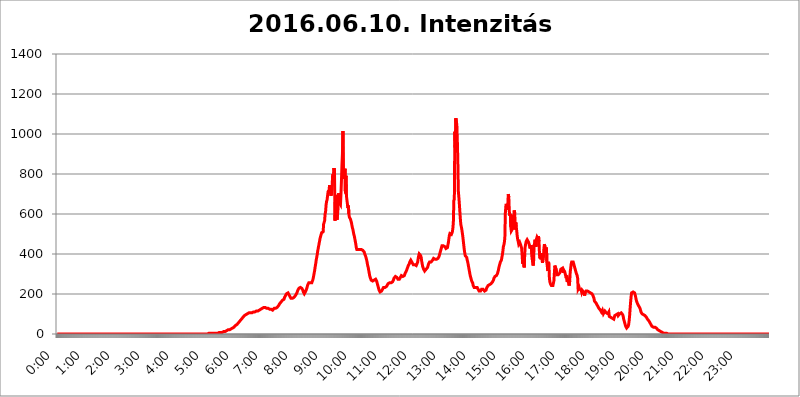
| Category | 2016.06.10. Intenzitás [W/m^2] |
|---|---|
| 0.0 | 0 |
| 0.0006944444444444445 | 0 |
| 0.001388888888888889 | 0 |
| 0.0020833333333333333 | 0 |
| 0.002777777777777778 | 0 |
| 0.003472222222222222 | 0 |
| 0.004166666666666667 | 0 |
| 0.004861111111111111 | 0 |
| 0.005555555555555556 | 0 |
| 0.0062499999999999995 | 0 |
| 0.006944444444444444 | 0 |
| 0.007638888888888889 | 0 |
| 0.008333333333333333 | 0 |
| 0.009027777777777779 | 0 |
| 0.009722222222222222 | 0 |
| 0.010416666666666666 | 0 |
| 0.011111111111111112 | 0 |
| 0.011805555555555555 | 0 |
| 0.012499999999999999 | 0 |
| 0.013194444444444444 | 0 |
| 0.013888888888888888 | 0 |
| 0.014583333333333332 | 0 |
| 0.015277777777777777 | 0 |
| 0.015972222222222224 | 0 |
| 0.016666666666666666 | 0 |
| 0.017361111111111112 | 0 |
| 0.018055555555555557 | 0 |
| 0.01875 | 0 |
| 0.019444444444444445 | 0 |
| 0.02013888888888889 | 0 |
| 0.020833333333333332 | 0 |
| 0.02152777777777778 | 0 |
| 0.022222222222222223 | 0 |
| 0.02291666666666667 | 0 |
| 0.02361111111111111 | 0 |
| 0.024305555555555556 | 0 |
| 0.024999999999999998 | 0 |
| 0.025694444444444447 | 0 |
| 0.02638888888888889 | 0 |
| 0.027083333333333334 | 0 |
| 0.027777777777777776 | 0 |
| 0.02847222222222222 | 0 |
| 0.029166666666666664 | 0 |
| 0.029861111111111113 | 0 |
| 0.030555555555555555 | 0 |
| 0.03125 | 0 |
| 0.03194444444444445 | 0 |
| 0.03263888888888889 | 0 |
| 0.03333333333333333 | 0 |
| 0.034027777777777775 | 0 |
| 0.034722222222222224 | 0 |
| 0.035416666666666666 | 0 |
| 0.036111111111111115 | 0 |
| 0.03680555555555556 | 0 |
| 0.0375 | 0 |
| 0.03819444444444444 | 0 |
| 0.03888888888888889 | 0 |
| 0.03958333333333333 | 0 |
| 0.04027777777777778 | 0 |
| 0.04097222222222222 | 0 |
| 0.041666666666666664 | 0 |
| 0.042361111111111106 | 0 |
| 0.04305555555555556 | 0 |
| 0.043750000000000004 | 0 |
| 0.044444444444444446 | 0 |
| 0.04513888888888889 | 0 |
| 0.04583333333333334 | 0 |
| 0.04652777777777778 | 0 |
| 0.04722222222222222 | 0 |
| 0.04791666666666666 | 0 |
| 0.04861111111111111 | 0 |
| 0.049305555555555554 | 0 |
| 0.049999999999999996 | 0 |
| 0.05069444444444445 | 0 |
| 0.051388888888888894 | 0 |
| 0.052083333333333336 | 0 |
| 0.05277777777777778 | 0 |
| 0.05347222222222222 | 0 |
| 0.05416666666666667 | 0 |
| 0.05486111111111111 | 0 |
| 0.05555555555555555 | 0 |
| 0.05625 | 0 |
| 0.05694444444444444 | 0 |
| 0.057638888888888885 | 0 |
| 0.05833333333333333 | 0 |
| 0.05902777777777778 | 0 |
| 0.059722222222222225 | 0 |
| 0.06041666666666667 | 0 |
| 0.061111111111111116 | 0 |
| 0.06180555555555556 | 0 |
| 0.0625 | 0 |
| 0.06319444444444444 | 0 |
| 0.06388888888888888 | 0 |
| 0.06458333333333334 | 0 |
| 0.06527777777777778 | 0 |
| 0.06597222222222222 | 0 |
| 0.06666666666666667 | 0 |
| 0.06736111111111111 | 0 |
| 0.06805555555555555 | 0 |
| 0.06874999999999999 | 0 |
| 0.06944444444444443 | 0 |
| 0.07013888888888889 | 0 |
| 0.07083333333333333 | 0 |
| 0.07152777777777779 | 0 |
| 0.07222222222222223 | 0 |
| 0.07291666666666667 | 0 |
| 0.07361111111111111 | 0 |
| 0.07430555555555556 | 0 |
| 0.075 | 0 |
| 0.07569444444444444 | 0 |
| 0.0763888888888889 | 0 |
| 0.07708333333333334 | 0 |
| 0.07777777777777778 | 0 |
| 0.07847222222222222 | 0 |
| 0.07916666666666666 | 0 |
| 0.0798611111111111 | 0 |
| 0.08055555555555556 | 0 |
| 0.08125 | 0 |
| 0.08194444444444444 | 0 |
| 0.08263888888888889 | 0 |
| 0.08333333333333333 | 0 |
| 0.08402777777777777 | 0 |
| 0.08472222222222221 | 0 |
| 0.08541666666666665 | 0 |
| 0.08611111111111112 | 0 |
| 0.08680555555555557 | 0 |
| 0.08750000000000001 | 0 |
| 0.08819444444444445 | 0 |
| 0.08888888888888889 | 0 |
| 0.08958333333333333 | 0 |
| 0.09027777777777778 | 0 |
| 0.09097222222222222 | 0 |
| 0.09166666666666667 | 0 |
| 0.09236111111111112 | 0 |
| 0.09305555555555556 | 0 |
| 0.09375 | 0 |
| 0.09444444444444444 | 0 |
| 0.09513888888888888 | 0 |
| 0.09583333333333333 | 0 |
| 0.09652777777777777 | 0 |
| 0.09722222222222222 | 0 |
| 0.09791666666666667 | 0 |
| 0.09861111111111111 | 0 |
| 0.09930555555555555 | 0 |
| 0.09999999999999999 | 0 |
| 0.10069444444444443 | 0 |
| 0.1013888888888889 | 0 |
| 0.10208333333333335 | 0 |
| 0.10277777777777779 | 0 |
| 0.10347222222222223 | 0 |
| 0.10416666666666667 | 0 |
| 0.10486111111111111 | 0 |
| 0.10555555555555556 | 0 |
| 0.10625 | 0 |
| 0.10694444444444444 | 0 |
| 0.1076388888888889 | 0 |
| 0.10833333333333334 | 0 |
| 0.10902777777777778 | 0 |
| 0.10972222222222222 | 0 |
| 0.1111111111111111 | 0 |
| 0.11180555555555556 | 0 |
| 0.11180555555555556 | 0 |
| 0.1125 | 0 |
| 0.11319444444444444 | 0 |
| 0.11388888888888889 | 0 |
| 0.11458333333333333 | 0 |
| 0.11527777777777777 | 0 |
| 0.11597222222222221 | 0 |
| 0.11666666666666665 | 0 |
| 0.1173611111111111 | 0 |
| 0.11805555555555557 | 0 |
| 0.11944444444444445 | 0 |
| 0.12013888888888889 | 0 |
| 0.12083333333333333 | 0 |
| 0.12152777777777778 | 0 |
| 0.12222222222222223 | 0 |
| 0.12291666666666667 | 0 |
| 0.12291666666666667 | 0 |
| 0.12361111111111112 | 0 |
| 0.12430555555555556 | 0 |
| 0.125 | 0 |
| 0.12569444444444444 | 0 |
| 0.12638888888888888 | 0 |
| 0.12708333333333333 | 0 |
| 0.16875 | 0 |
| 0.12847222222222224 | 0 |
| 0.12916666666666668 | 0 |
| 0.12986111111111112 | 0 |
| 0.13055555555555556 | 0 |
| 0.13125 | 0 |
| 0.13194444444444445 | 0 |
| 0.1326388888888889 | 0 |
| 0.13333333333333333 | 0 |
| 0.13402777777777777 | 0 |
| 0.13402777777777777 | 0 |
| 0.13472222222222222 | 0 |
| 0.13541666666666666 | 0 |
| 0.1361111111111111 | 0 |
| 0.13749999999999998 | 0 |
| 0.13819444444444443 | 0 |
| 0.1388888888888889 | 0 |
| 0.13958333333333334 | 0 |
| 0.14027777777777778 | 0 |
| 0.14097222222222222 | 0 |
| 0.14166666666666666 | 0 |
| 0.1423611111111111 | 0 |
| 0.14305555555555557 | 0 |
| 0.14375000000000002 | 0 |
| 0.14444444444444446 | 0 |
| 0.1451388888888889 | 0 |
| 0.1451388888888889 | 0 |
| 0.14652777777777778 | 0 |
| 0.14722222222222223 | 0 |
| 0.14791666666666667 | 0 |
| 0.1486111111111111 | 0 |
| 0.14930555555555555 | 0 |
| 0.15 | 0 |
| 0.15069444444444444 | 0 |
| 0.15138888888888888 | 0 |
| 0.15208333333333332 | 0 |
| 0.15277777777777776 | 0 |
| 0.15347222222222223 | 0 |
| 0.15416666666666667 | 0 |
| 0.15486111111111112 | 0 |
| 0.15555555555555556 | 0 |
| 0.15625 | 0 |
| 0.15694444444444444 | 0 |
| 0.15763888888888888 | 0 |
| 0.15833333333333333 | 0 |
| 0.15902777777777777 | 0 |
| 0.15972222222222224 | 0 |
| 0.16041666666666668 | 0 |
| 0.16111111111111112 | 0 |
| 0.16180555555555556 | 0 |
| 0.1625 | 0 |
| 0.16319444444444445 | 0 |
| 0.1638888888888889 | 0 |
| 0.16458333333333333 | 0 |
| 0.16527777777777777 | 0 |
| 0.16597222222222222 | 0 |
| 0.16666666666666666 | 0 |
| 0.1673611111111111 | 0 |
| 0.16805555555555554 | 0 |
| 0.16874999999999998 | 0 |
| 0.16944444444444443 | 0 |
| 0.17013888888888887 | 0 |
| 0.1708333333333333 | 0 |
| 0.17152777777777775 | 0 |
| 0.17222222222222225 | 0 |
| 0.1729166666666667 | 0 |
| 0.17361111111111113 | 0 |
| 0.17430555555555557 | 0 |
| 0.17500000000000002 | 0 |
| 0.17569444444444446 | 0 |
| 0.1763888888888889 | 0 |
| 0.17708333333333334 | 0 |
| 0.17777777777777778 | 0 |
| 0.17847222222222223 | 0 |
| 0.17916666666666667 | 0 |
| 0.1798611111111111 | 0 |
| 0.18055555555555555 | 0 |
| 0.18125 | 0 |
| 0.18194444444444444 | 0 |
| 0.1826388888888889 | 0 |
| 0.18333333333333335 | 0 |
| 0.1840277777777778 | 0 |
| 0.18472222222222223 | 0 |
| 0.18541666666666667 | 0 |
| 0.18611111111111112 | 0 |
| 0.18680555555555556 | 0 |
| 0.1875 | 0 |
| 0.18819444444444444 | 0 |
| 0.18888888888888888 | 0 |
| 0.18958333333333333 | 0 |
| 0.19027777777777777 | 0 |
| 0.1909722222222222 | 0 |
| 0.19166666666666665 | 0 |
| 0.19236111111111112 | 0 |
| 0.19305555555555554 | 0 |
| 0.19375 | 0 |
| 0.19444444444444445 | 0 |
| 0.1951388888888889 | 0 |
| 0.19583333333333333 | 0 |
| 0.19652777777777777 | 0 |
| 0.19722222222222222 | 0 |
| 0.19791666666666666 | 0 |
| 0.1986111111111111 | 0 |
| 0.19930555555555554 | 0 |
| 0.19999999999999998 | 0 |
| 0.20069444444444443 | 0 |
| 0.20138888888888887 | 0 |
| 0.2020833333333333 | 0 |
| 0.2027777777777778 | 0 |
| 0.2034722222222222 | 0 |
| 0.2041666666666667 | 0 |
| 0.20486111111111113 | 0 |
| 0.20555555555555557 | 0 |
| 0.20625000000000002 | 0 |
| 0.20694444444444446 | 0 |
| 0.2076388888888889 | 0 |
| 0.20833333333333334 | 0 |
| 0.20902777777777778 | 0 |
| 0.20972222222222223 | 0 |
| 0.21041666666666667 | 0 |
| 0.2111111111111111 | 0 |
| 0.21180555555555555 | 0 |
| 0.2125 | 3.525 |
| 0.21319444444444444 | 3.525 |
| 0.2138888888888889 | 3.525 |
| 0.21458333333333335 | 3.525 |
| 0.2152777777777778 | 3.525 |
| 0.21597222222222223 | 3.525 |
| 0.21666666666666667 | 3.525 |
| 0.21736111111111112 | 3.525 |
| 0.21805555555555556 | 3.525 |
| 0.21875 | 3.525 |
| 0.21944444444444444 | 3.525 |
| 0.22013888888888888 | 3.525 |
| 0.22083333333333333 | 3.525 |
| 0.22152777777777777 | 3.525 |
| 0.2222222222222222 | 3.525 |
| 0.22291666666666665 | 3.525 |
| 0.2236111111111111 | 3.525 |
| 0.22430555555555556 | 3.525 |
| 0.225 | 3.525 |
| 0.22569444444444445 | 3.525 |
| 0.2263888888888889 | 7.887 |
| 0.22708333333333333 | 7.887 |
| 0.22777777777777777 | 7.887 |
| 0.22847222222222222 | 7.887 |
| 0.22916666666666666 | 7.887 |
| 0.2298611111111111 | 7.887 |
| 0.23055555555555554 | 7.887 |
| 0.23124999999999998 | 7.887 |
| 0.23194444444444443 | 12.257 |
| 0.23263888888888887 | 12.257 |
| 0.2333333333333333 | 12.257 |
| 0.2340277777777778 | 12.257 |
| 0.2347222222222222 | 12.257 |
| 0.2354166666666667 | 12.257 |
| 0.23611111111111113 | 16.636 |
| 0.23680555555555557 | 16.636 |
| 0.23750000000000002 | 16.636 |
| 0.23819444444444446 | 16.636 |
| 0.2388888888888889 | 21.024 |
| 0.23958333333333334 | 21.024 |
| 0.24027777777777778 | 21.024 |
| 0.24097222222222223 | 21.024 |
| 0.24166666666666667 | 21.024 |
| 0.2423611111111111 | 21.024 |
| 0.24305555555555555 | 21.024 |
| 0.24375 | 25.419 |
| 0.24444444444444446 | 25.419 |
| 0.24513888888888888 | 29.823 |
| 0.24583333333333335 | 29.823 |
| 0.2465277777777778 | 29.823 |
| 0.24722222222222223 | 34.234 |
| 0.24791666666666667 | 34.234 |
| 0.24861111111111112 | 38.653 |
| 0.24930555555555556 | 38.653 |
| 0.25 | 43.079 |
| 0.25069444444444444 | 43.079 |
| 0.2513888888888889 | 47.511 |
| 0.2520833333333333 | 47.511 |
| 0.25277777777777777 | 51.951 |
| 0.2534722222222222 | 51.951 |
| 0.25416666666666665 | 56.398 |
| 0.2548611111111111 | 56.398 |
| 0.2555555555555556 | 60.85 |
| 0.25625000000000003 | 65.31 |
| 0.2569444444444445 | 65.31 |
| 0.2576388888888889 | 69.775 |
| 0.25833333333333336 | 74.246 |
| 0.2590277777777778 | 74.246 |
| 0.25972222222222224 | 78.722 |
| 0.2604166666666667 | 83.205 |
| 0.2611111111111111 | 83.205 |
| 0.26180555555555557 | 87.692 |
| 0.2625 | 92.184 |
| 0.26319444444444445 | 92.184 |
| 0.2638888888888889 | 92.184 |
| 0.26458333333333334 | 96.682 |
| 0.2652777777777778 | 96.682 |
| 0.2659722222222222 | 101.184 |
| 0.26666666666666666 | 101.184 |
| 0.2673611111111111 | 101.184 |
| 0.26805555555555555 | 101.184 |
| 0.26875 | 105.69 |
| 0.26944444444444443 | 105.69 |
| 0.2701388888888889 | 105.69 |
| 0.2708333333333333 | 105.69 |
| 0.27152777777777776 | 105.69 |
| 0.2722222222222222 | 105.69 |
| 0.27291666666666664 | 105.69 |
| 0.2736111111111111 | 105.69 |
| 0.2743055555555555 | 105.69 |
| 0.27499999999999997 | 110.201 |
| 0.27569444444444446 | 110.201 |
| 0.27638888888888885 | 110.201 |
| 0.27708333333333335 | 110.201 |
| 0.2777777777777778 | 110.201 |
| 0.27847222222222223 | 110.201 |
| 0.2791666666666667 | 114.716 |
| 0.2798611111111111 | 110.201 |
| 0.28055555555555556 | 114.716 |
| 0.28125 | 114.716 |
| 0.28194444444444444 | 119.235 |
| 0.2826388888888889 | 119.235 |
| 0.2833333333333333 | 119.235 |
| 0.28402777777777777 | 119.235 |
| 0.2847222222222222 | 123.758 |
| 0.28541666666666665 | 123.758 |
| 0.28611111111111115 | 123.758 |
| 0.28680555555555554 | 128.284 |
| 0.28750000000000003 | 128.284 |
| 0.2881944444444445 | 128.284 |
| 0.2888888888888889 | 132.814 |
| 0.28958333333333336 | 132.814 |
| 0.2902777777777778 | 132.814 |
| 0.29097222222222224 | 132.814 |
| 0.2916666666666667 | 132.814 |
| 0.2923611111111111 | 128.284 |
| 0.29305555555555557 | 128.284 |
| 0.29375 | 128.284 |
| 0.29444444444444445 | 128.284 |
| 0.2951388888888889 | 128.284 |
| 0.29583333333333334 | 128.284 |
| 0.2965277777777778 | 128.284 |
| 0.2972222222222222 | 128.284 |
| 0.29791666666666666 | 123.758 |
| 0.2986111111111111 | 128.284 |
| 0.29930555555555555 | 123.758 |
| 0.3 | 123.758 |
| 0.30069444444444443 | 119.235 |
| 0.3013888888888889 | 119.235 |
| 0.3020833333333333 | 119.235 |
| 0.30277777777777776 | 123.758 |
| 0.3034722222222222 | 123.758 |
| 0.30416666666666664 | 128.284 |
| 0.3048611111111111 | 128.284 |
| 0.3055555555555555 | 128.284 |
| 0.30624999999999997 | 128.284 |
| 0.3069444444444444 | 132.814 |
| 0.3076388888888889 | 132.814 |
| 0.30833333333333335 | 132.814 |
| 0.3090277777777778 | 137.347 |
| 0.30972222222222223 | 137.347 |
| 0.3104166666666667 | 141.884 |
| 0.3111111111111111 | 146.423 |
| 0.31180555555555556 | 150.964 |
| 0.3125 | 155.509 |
| 0.31319444444444444 | 155.509 |
| 0.3138888888888889 | 160.056 |
| 0.3145833333333333 | 164.605 |
| 0.31527777777777777 | 164.605 |
| 0.3159722222222222 | 169.156 |
| 0.31666666666666665 | 169.156 |
| 0.31736111111111115 | 173.709 |
| 0.31805555555555554 | 173.709 |
| 0.31875000000000003 | 182.82 |
| 0.3194444444444445 | 182.82 |
| 0.3201388888888889 | 191.937 |
| 0.32083333333333336 | 196.497 |
| 0.3215277777777778 | 201.058 |
| 0.32222222222222224 | 201.058 |
| 0.3229166666666667 | 205.62 |
| 0.3236111111111111 | 205.62 |
| 0.32430555555555557 | 201.058 |
| 0.325 | 196.497 |
| 0.32569444444444445 | 191.937 |
| 0.3263888888888889 | 187.378 |
| 0.32708333333333334 | 182.82 |
| 0.3277777777777778 | 178.264 |
| 0.3284722222222222 | 173.709 |
| 0.32916666666666666 | 173.709 |
| 0.3298611111111111 | 178.264 |
| 0.33055555555555555 | 178.264 |
| 0.33125 | 182.82 |
| 0.33194444444444443 | 182.82 |
| 0.3326388888888889 | 187.378 |
| 0.3333333333333333 | 187.378 |
| 0.3340277777777778 | 191.937 |
| 0.3347222222222222 | 196.497 |
| 0.3354166666666667 | 196.497 |
| 0.3361111111111111 | 205.62 |
| 0.3368055555555556 | 210.182 |
| 0.33749999999999997 | 219.309 |
| 0.33819444444444446 | 219.309 |
| 0.33888888888888885 | 228.436 |
| 0.33958333333333335 | 228.436 |
| 0.34027777777777773 | 233 |
| 0.34097222222222223 | 233 |
| 0.3416666666666666 | 233 |
| 0.3423611111111111 | 233 |
| 0.3430555555555555 | 228.436 |
| 0.34375 | 223.873 |
| 0.3444444444444445 | 219.309 |
| 0.3451388888888889 | 210.182 |
| 0.3458333333333334 | 205.62 |
| 0.34652777777777777 | 201.058 |
| 0.34722222222222227 | 201.058 |
| 0.34791666666666665 | 205.62 |
| 0.34861111111111115 | 214.746 |
| 0.34930555555555554 | 219.309 |
| 0.35000000000000003 | 228.436 |
| 0.3506944444444444 | 237.564 |
| 0.3513888888888889 | 246.689 |
| 0.3520833333333333 | 251.251 |
| 0.3527777777777778 | 255.813 |
| 0.3534722222222222 | 255.813 |
| 0.3541666666666667 | 255.813 |
| 0.3548611111111111 | 255.813 |
| 0.35555555555555557 | 251.251 |
| 0.35625 | 251.251 |
| 0.35694444444444445 | 255.813 |
| 0.3576388888888889 | 260.373 |
| 0.35833333333333334 | 269.49 |
| 0.3590277777777778 | 278.603 |
| 0.3597222222222222 | 292.259 |
| 0.36041666666666666 | 305.898 |
| 0.3611111111111111 | 319.517 |
| 0.36180555555555555 | 337.639 |
| 0.3625 | 351.198 |
| 0.36319444444444443 | 369.23 |
| 0.3638888888888889 | 382.715 |
| 0.3645833333333333 | 396.164 |
| 0.3652777777777778 | 414.035 |
| 0.3659722222222222 | 427.39 |
| 0.3666666666666667 | 440.702 |
| 0.3673611111111111 | 453.968 |
| 0.3680555555555556 | 467.187 |
| 0.36874999999999997 | 480.356 |
| 0.36944444444444446 | 489.108 |
| 0.37013888888888885 | 497.836 |
| 0.37083333333333335 | 506.542 |
| 0.37152777777777773 | 510.885 |
| 0.37222222222222223 | 506.542 |
| 0.3729166666666666 | 510.885 |
| 0.3736111111111111 | 549.704 |
| 0.3743055555555555 | 558.261 |
| 0.375 | 566.793 |
| 0.3756944444444445 | 600.661 |
| 0.3763888888888889 | 613.252 |
| 0.3770833333333334 | 646.537 |
| 0.37777777777777777 | 663.019 |
| 0.37847222222222227 | 671.22 |
| 0.37916666666666665 | 691.608 |
| 0.37986111111111115 | 711.832 |
| 0.38055555555555554 | 715.858 |
| 0.38125000000000003 | 719.877 |
| 0.3819444444444444 | 743.859 |
| 0.3826388888888889 | 703.762 |
| 0.3833333333333333 | 727.896 |
| 0.3840277777777778 | 691.608 |
| 0.3847222222222222 | 711.832 |
| 0.3854166666666667 | 727.896 |
| 0.3861111111111111 | 787.258 |
| 0.38680555555555557 | 798.974 |
| 0.3875 | 763.674 |
| 0.38819444444444445 | 829.981 |
| 0.3888888888888889 | 798.974 |
| 0.38958333333333334 | 566.793 |
| 0.3902777777777778 | 695.666 |
| 0.3909722222222222 | 642.4 |
| 0.39166666666666666 | 613.252 |
| 0.3923611111111111 | 571.049 |
| 0.39305555555555555 | 596.45 |
| 0.39375 | 625.784 |
| 0.39444444444444443 | 703.762 |
| 0.3951388888888889 | 683.473 |
| 0.3958333333333333 | 654.791 |
| 0.3965277777777778 | 654.791 |
| 0.3972222222222222 | 646.537 |
| 0.3979166666666667 | 699.717 |
| 0.3986111111111111 | 767.62 |
| 0.3993055555555556 | 845.365 |
| 0.39999999999999997 | 902.447 |
| 0.40069444444444446 | 1014.852 |
| 0.40138888888888885 | 775.492 |
| 0.40208333333333335 | 810.641 |
| 0.40277777777777773 | 775.492 |
| 0.40347222222222223 | 826.123 |
| 0.4041666666666666 | 703.762 |
| 0.4048611111111111 | 791.169 |
| 0.4055555555555555 | 691.608 |
| 0.40625 | 671.22 |
| 0.4069444444444445 | 650.667 |
| 0.4076388888888889 | 629.948 |
| 0.4083333333333334 | 642.4 |
| 0.40902777777777777 | 600.661 |
| 0.40972222222222227 | 583.779 |
| 0.41041666666666665 | 579.542 |
| 0.41111111111111115 | 575.299 |
| 0.41180555555555554 | 566.793 |
| 0.41250000000000003 | 558.261 |
| 0.4131944444444444 | 545.416 |
| 0.4138888888888889 | 532.513 |
| 0.4145833333333333 | 523.88 |
| 0.4152777777777778 | 510.885 |
| 0.4159722222222222 | 497.836 |
| 0.4166666666666667 | 489.108 |
| 0.4173611111111111 | 475.972 |
| 0.41805555555555557 | 462.786 |
| 0.41875 | 449.551 |
| 0.41944444444444445 | 431.833 |
| 0.4201388888888889 | 422.943 |
| 0.42083333333333334 | 418.492 |
| 0.4215277777777778 | 422.943 |
| 0.4222222222222222 | 422.943 |
| 0.42291666666666666 | 427.39 |
| 0.4236111111111111 | 422.943 |
| 0.42430555555555555 | 422.943 |
| 0.425 | 422.943 |
| 0.42569444444444443 | 422.943 |
| 0.4263888888888889 | 422.943 |
| 0.4270833333333333 | 422.943 |
| 0.4277777777777778 | 422.943 |
| 0.4284722222222222 | 418.492 |
| 0.4291666666666667 | 418.492 |
| 0.4298611111111111 | 414.035 |
| 0.4305555555555556 | 409.574 |
| 0.43124999999999997 | 400.638 |
| 0.43194444444444446 | 396.164 |
| 0.43263888888888885 | 387.202 |
| 0.43333333333333335 | 378.224 |
| 0.43402777777777773 | 369.23 |
| 0.43472222222222223 | 355.712 |
| 0.4354166666666666 | 342.162 |
| 0.4361111111111111 | 333.113 |
| 0.4368055555555555 | 319.517 |
| 0.4375 | 305.898 |
| 0.4381944444444445 | 292.259 |
| 0.4388888888888889 | 283.156 |
| 0.4395833333333334 | 278.603 |
| 0.44027777777777777 | 269.49 |
| 0.44097222222222227 | 264.932 |
| 0.44166666666666665 | 264.932 |
| 0.44236111111111115 | 264.932 |
| 0.44305555555555554 | 264.932 |
| 0.44375000000000003 | 264.932 |
| 0.4444444444444444 | 269.49 |
| 0.4451388888888889 | 274.047 |
| 0.4458333333333333 | 274.047 |
| 0.4465277777777778 | 274.047 |
| 0.4472222222222222 | 269.49 |
| 0.4479166666666667 | 264.932 |
| 0.4486111111111111 | 255.813 |
| 0.44930555555555557 | 246.689 |
| 0.45 | 237.564 |
| 0.45069444444444445 | 228.436 |
| 0.4513888888888889 | 219.309 |
| 0.45208333333333334 | 214.746 |
| 0.4527777777777778 | 210.182 |
| 0.4534722222222222 | 210.182 |
| 0.45416666666666666 | 210.182 |
| 0.4548611111111111 | 214.746 |
| 0.45555555555555555 | 219.309 |
| 0.45625 | 223.873 |
| 0.45694444444444443 | 228.436 |
| 0.4576388888888889 | 233 |
| 0.4583333333333333 | 233 |
| 0.4590277777777778 | 233 |
| 0.4597222222222222 | 233 |
| 0.4604166666666667 | 233 |
| 0.4611111111111111 | 233 |
| 0.4618055555555556 | 237.564 |
| 0.46249999999999997 | 242.127 |
| 0.46319444444444446 | 242.127 |
| 0.46388888888888885 | 251.251 |
| 0.46458333333333335 | 251.251 |
| 0.46527777777777773 | 255.813 |
| 0.46597222222222223 | 255.813 |
| 0.4666666666666666 | 255.813 |
| 0.4673611111111111 | 255.813 |
| 0.4680555555555555 | 255.813 |
| 0.46875 | 255.813 |
| 0.4694444444444445 | 260.373 |
| 0.4701388888888889 | 260.373 |
| 0.4708333333333334 | 264.932 |
| 0.47152777777777777 | 269.49 |
| 0.47222222222222227 | 278.603 |
| 0.47291666666666665 | 278.603 |
| 0.47361111111111115 | 283.156 |
| 0.47430555555555554 | 287.709 |
| 0.47500000000000003 | 287.709 |
| 0.4756944444444444 | 283.156 |
| 0.4763888888888889 | 283.156 |
| 0.4770833333333333 | 278.603 |
| 0.4777777777777778 | 274.047 |
| 0.4784722222222222 | 269.49 |
| 0.4791666666666667 | 269.49 |
| 0.4798611111111111 | 274.047 |
| 0.48055555555555557 | 278.603 |
| 0.48125 | 283.156 |
| 0.48194444444444445 | 287.709 |
| 0.4826388888888889 | 292.259 |
| 0.48333333333333334 | 292.259 |
| 0.4840277777777778 | 287.709 |
| 0.4847222222222222 | 287.709 |
| 0.48541666666666666 | 283.156 |
| 0.4861111111111111 | 287.709 |
| 0.48680555555555555 | 292.259 |
| 0.4875 | 296.808 |
| 0.48819444444444443 | 305.898 |
| 0.4888888888888889 | 310.44 |
| 0.4895833333333333 | 314.98 |
| 0.4902777777777778 | 319.517 |
| 0.4909722222222222 | 328.584 |
| 0.4916666666666667 | 333.113 |
| 0.4923611111111111 | 342.162 |
| 0.4930555555555556 | 346.682 |
| 0.49374999999999997 | 351.198 |
| 0.49444444444444446 | 360.221 |
| 0.49513888888888885 | 364.728 |
| 0.49583333333333335 | 369.23 |
| 0.49652777777777773 | 369.23 |
| 0.49722222222222223 | 364.728 |
| 0.4979166666666666 | 355.712 |
| 0.4986111111111111 | 351.198 |
| 0.4993055555555555 | 346.682 |
| 0.5 | 346.682 |
| 0.5006944444444444 | 346.682 |
| 0.5013888888888889 | 346.682 |
| 0.5020833333333333 | 346.682 |
| 0.5027777777777778 | 342.162 |
| 0.5034722222222222 | 342.162 |
| 0.5041666666666667 | 342.162 |
| 0.5048611111111111 | 346.682 |
| 0.5055555555555555 | 360.221 |
| 0.50625 | 378.224 |
| 0.5069444444444444 | 391.685 |
| 0.5076388888888889 | 400.638 |
| 0.5083333333333333 | 400.638 |
| 0.5090277777777777 | 396.164 |
| 0.5097222222222222 | 391.685 |
| 0.5104166666666666 | 382.715 |
| 0.5111111111111112 | 364.728 |
| 0.5118055555555555 | 351.198 |
| 0.5125000000000001 | 337.639 |
| 0.5131944444444444 | 333.113 |
| 0.513888888888889 | 324.052 |
| 0.5145833333333333 | 319.517 |
| 0.5152777777777778 | 314.98 |
| 0.5159722222222222 | 314.98 |
| 0.5166666666666667 | 319.517 |
| 0.517361111111111 | 324.052 |
| 0.5180555555555556 | 328.584 |
| 0.5187499999999999 | 328.584 |
| 0.5194444444444445 | 333.113 |
| 0.5201388888888888 | 342.162 |
| 0.5208333333333334 | 351.198 |
| 0.5215277777777778 | 355.712 |
| 0.5222222222222223 | 360.221 |
| 0.5229166666666667 | 360.221 |
| 0.5236111111111111 | 360.221 |
| 0.5243055555555556 | 360.221 |
| 0.525 | 360.221 |
| 0.5256944444444445 | 364.728 |
| 0.5263888888888889 | 369.23 |
| 0.5270833333333333 | 373.729 |
| 0.5277777777777778 | 378.224 |
| 0.5284722222222222 | 378.224 |
| 0.5291666666666667 | 378.224 |
| 0.5298611111111111 | 373.729 |
| 0.5305555555555556 | 373.729 |
| 0.53125 | 373.729 |
| 0.5319444444444444 | 373.729 |
| 0.5326388888888889 | 373.729 |
| 0.5333333333333333 | 378.224 |
| 0.5340277777777778 | 378.224 |
| 0.5347222222222222 | 382.715 |
| 0.5354166666666667 | 387.202 |
| 0.5361111111111111 | 391.685 |
| 0.5368055555555555 | 405.108 |
| 0.5375 | 414.035 |
| 0.5381944444444444 | 422.943 |
| 0.5388888888888889 | 431.833 |
| 0.5395833333333333 | 440.702 |
| 0.5402777777777777 | 440.702 |
| 0.5409722222222222 | 445.129 |
| 0.5416666666666666 | 440.702 |
| 0.5423611111111112 | 440.702 |
| 0.5430555555555555 | 440.702 |
| 0.5437500000000001 | 436.27 |
| 0.5444444444444444 | 431.833 |
| 0.545138888888889 | 427.39 |
| 0.5458333333333333 | 427.39 |
| 0.5465277777777778 | 427.39 |
| 0.5472222222222222 | 431.833 |
| 0.5479166666666667 | 445.129 |
| 0.548611111111111 | 458.38 |
| 0.5493055555555556 | 475.972 |
| 0.5499999999999999 | 493.475 |
| 0.5506944444444445 | 502.192 |
| 0.5513888888888888 | 502.192 |
| 0.5520833333333334 | 502.192 |
| 0.5527777777777778 | 497.836 |
| 0.5534722222222223 | 502.192 |
| 0.5541666666666667 | 510.885 |
| 0.5548611111111111 | 528.2 |
| 0.5555555555555556 | 558.261 |
| 0.55625 | 667.123 |
| 0.5569444444444445 | 675.311 |
| 0.5576388888888889 | 1011.118 |
| 0.5583333333333333 | 932.576 |
| 0.5590277777777778 | 1078.555 |
| 0.5597222222222222 | 1059.756 |
| 0.5604166666666667 | 1048.508 |
| 0.5611111111111111 | 970.034 |
| 0.5618055555555556 | 868.305 |
| 0.5625 | 715.858 |
| 0.5631944444444444 | 687.544 |
| 0.5638888888888889 | 654.791 |
| 0.5645833333333333 | 617.436 |
| 0.5652777777777778 | 579.542 |
| 0.5659722222222222 | 549.704 |
| 0.5666666666666667 | 536.82 |
| 0.5673611111111111 | 523.88 |
| 0.5680555555555555 | 506.542 |
| 0.56875 | 489.108 |
| 0.5694444444444444 | 467.187 |
| 0.5701388888888889 | 445.129 |
| 0.5708333333333333 | 422.943 |
| 0.5715277777777777 | 405.108 |
| 0.5722222222222222 | 391.685 |
| 0.5729166666666666 | 387.202 |
| 0.5736111111111112 | 387.202 |
| 0.5743055555555555 | 382.715 |
| 0.5750000000000001 | 369.23 |
| 0.5756944444444444 | 360.221 |
| 0.576388888888889 | 346.682 |
| 0.5770833333333333 | 333.113 |
| 0.5777777777777778 | 319.517 |
| 0.5784722222222222 | 305.898 |
| 0.5791666666666667 | 292.259 |
| 0.579861111111111 | 283.156 |
| 0.5805555555555556 | 274.047 |
| 0.5812499999999999 | 264.932 |
| 0.5819444444444445 | 260.373 |
| 0.5826388888888888 | 255.813 |
| 0.5833333333333334 | 242.127 |
| 0.5840277777777778 | 237.564 |
| 0.5847222222222223 | 233 |
| 0.5854166666666667 | 228.436 |
| 0.5861111111111111 | 228.436 |
| 0.5868055555555556 | 233 |
| 0.5875 | 233 |
| 0.5881944444444445 | 233 |
| 0.5888888888888889 | 233 |
| 0.5895833333333333 | 228.436 |
| 0.5902777777777778 | 223.873 |
| 0.5909722222222222 | 219.309 |
| 0.5916666666666667 | 214.746 |
| 0.5923611111111111 | 210.182 |
| 0.5930555555555556 | 210.182 |
| 0.59375 | 214.746 |
| 0.5944444444444444 | 219.309 |
| 0.5951388888888889 | 223.873 |
| 0.5958333333333333 | 228.436 |
| 0.5965277777777778 | 228.436 |
| 0.5972222222222222 | 223.873 |
| 0.5979166666666667 | 219.309 |
| 0.5986111111111111 | 219.309 |
| 0.5993055555555555 | 214.746 |
| 0.6 | 214.746 |
| 0.6006944444444444 | 219.309 |
| 0.6013888888888889 | 219.309 |
| 0.6020833333333333 | 228.436 |
| 0.6027777777777777 | 228.436 |
| 0.6034722222222222 | 233 |
| 0.6041666666666666 | 242.127 |
| 0.6048611111111112 | 246.689 |
| 0.6055555555555555 | 246.689 |
| 0.6062500000000001 | 246.689 |
| 0.6069444444444444 | 246.689 |
| 0.607638888888889 | 246.689 |
| 0.6083333333333333 | 251.251 |
| 0.6090277777777778 | 251.251 |
| 0.6097222222222222 | 255.813 |
| 0.6104166666666667 | 260.373 |
| 0.611111111111111 | 264.932 |
| 0.6118055555555556 | 269.49 |
| 0.6124999999999999 | 278.603 |
| 0.6131944444444445 | 283.156 |
| 0.6138888888888888 | 287.709 |
| 0.6145833333333334 | 287.709 |
| 0.6152777777777778 | 292.259 |
| 0.6159722222222223 | 292.259 |
| 0.6166666666666667 | 296.808 |
| 0.6173611111111111 | 301.354 |
| 0.6180555555555556 | 305.898 |
| 0.61875 | 319.517 |
| 0.6194444444444445 | 333.113 |
| 0.6201388888888889 | 342.162 |
| 0.6208333333333333 | 351.198 |
| 0.6215277777777778 | 360.221 |
| 0.6222222222222222 | 364.728 |
| 0.6229166666666667 | 369.23 |
| 0.6236111111111111 | 382.715 |
| 0.6243055555555556 | 396.164 |
| 0.625 | 414.035 |
| 0.6256944444444444 | 436.27 |
| 0.6263888888888889 | 445.129 |
| 0.6270833333333333 | 458.38 |
| 0.6277777777777778 | 480.356 |
| 0.6284722222222222 | 604.864 |
| 0.6291666666666667 | 638.256 |
| 0.6298611111111111 | 650.667 |
| 0.6305555555555555 | 621.613 |
| 0.63125 | 634.105 |
| 0.6319444444444444 | 650.667 |
| 0.6326388888888889 | 699.717 |
| 0.6333333333333333 | 683.473 |
| 0.6340277777777777 | 613.252 |
| 0.6347222222222222 | 592.233 |
| 0.6354166666666666 | 600.661 |
| 0.6361111111111112 | 536.82 |
| 0.6368055555555555 | 515.223 |
| 0.6375000000000001 | 515.223 |
| 0.6381944444444444 | 523.88 |
| 0.638888888888889 | 532.513 |
| 0.6395833333333333 | 596.45 |
| 0.6402777777777778 | 523.88 |
| 0.6409722222222222 | 617.436 |
| 0.6416666666666667 | 604.864 |
| 0.642361111111111 | 523.88 |
| 0.6430555555555556 | 558.261 |
| 0.6437499999999999 | 536.82 |
| 0.6444444444444445 | 515.223 |
| 0.6451388888888888 | 489.108 |
| 0.6458333333333334 | 471.582 |
| 0.6465277777777778 | 462.786 |
| 0.6472222222222223 | 449.551 |
| 0.6479166666666667 | 453.968 |
| 0.6486111111111111 | 458.38 |
| 0.6493055555555556 | 453.968 |
| 0.65 | 445.129 |
| 0.6506944444444445 | 440.702 |
| 0.6513888888888889 | 427.39 |
| 0.6520833333333333 | 422.943 |
| 0.6527777777777778 | 351.198 |
| 0.6534722222222222 | 382.715 |
| 0.6541666666666667 | 405.108 |
| 0.6548611111111111 | 333.113 |
| 0.6555555555555556 | 391.685 |
| 0.65625 | 436.27 |
| 0.6569444444444444 | 449.551 |
| 0.6576388888888889 | 462.786 |
| 0.6583333333333333 | 462.786 |
| 0.6590277777777778 | 471.582 |
| 0.6597222222222222 | 475.972 |
| 0.6604166666666667 | 471.582 |
| 0.6611111111111111 | 458.38 |
| 0.6618055555555555 | 449.551 |
| 0.6625 | 445.129 |
| 0.6631944444444444 | 427.39 |
| 0.6638888888888889 | 431.833 |
| 0.6645833333333333 | 445.129 |
| 0.6652777777777777 | 449.551 |
| 0.6659722222222222 | 445.129 |
| 0.6666666666666666 | 360.221 |
| 0.6673611111111111 | 342.162 |
| 0.6680555555555556 | 355.712 |
| 0.6687500000000001 | 440.702 |
| 0.6694444444444444 | 453.968 |
| 0.6701388888888888 | 471.582 |
| 0.6708333333333334 | 471.582 |
| 0.6715277777777778 | 436.27 |
| 0.6722222222222222 | 475.972 |
| 0.6729166666666666 | 484.735 |
| 0.6736111111111112 | 480.356 |
| 0.6743055555555556 | 475.972 |
| 0.6749999999999999 | 489.108 |
| 0.6756944444444444 | 462.786 |
| 0.6763888888888889 | 396.164 |
| 0.6770833333333334 | 378.224 |
| 0.6777777777777777 | 400.638 |
| 0.6784722222222223 | 373.729 |
| 0.6791666666666667 | 405.108 |
| 0.6798611111111111 | 373.729 |
| 0.6805555555555555 | 355.712 |
| 0.68125 | 351.198 |
| 0.6819444444444445 | 391.685 |
| 0.6826388888888889 | 431.833 |
| 0.6833333333333332 | 449.551 |
| 0.6840277777777778 | 449.551 |
| 0.6847222222222222 | 453.968 |
| 0.6854166666666667 | 405.108 |
| 0.686111111111111 | 431.833 |
| 0.6868055555555556 | 355.712 |
| 0.6875 | 333.113 |
| 0.6881944444444444 | 314.98 |
| 0.688888888888889 | 360.221 |
| 0.6895833333333333 | 351.198 |
| 0.6902777777777778 | 278.603 |
| 0.6909722222222222 | 260.373 |
| 0.6916666666666668 | 251.251 |
| 0.6923611111111111 | 246.689 |
| 0.6930555555555555 | 242.127 |
| 0.69375 | 237.564 |
| 0.6944444444444445 | 242.127 |
| 0.6951388888888889 | 242.127 |
| 0.6958333333333333 | 246.689 |
| 0.6965277777777777 | 264.932 |
| 0.6972222222222223 | 269.49 |
| 0.6979166666666666 | 342.162 |
| 0.6986111111111111 | 346.682 |
| 0.6993055555555556 | 337.639 |
| 0.7000000000000001 | 319.517 |
| 0.7006944444444444 | 296.808 |
| 0.7013888888888888 | 296.808 |
| 0.7020833333333334 | 296.808 |
| 0.7027777777777778 | 296.808 |
| 0.7034722222222222 | 296.808 |
| 0.7041666666666666 | 301.354 |
| 0.7048611111111112 | 305.898 |
| 0.7055555555555556 | 314.98 |
| 0.7062499999999999 | 324.052 |
| 0.7069444444444444 | 324.052 |
| 0.7076388888888889 | 328.584 |
| 0.7083333333333334 | 328.584 |
| 0.7090277777777777 | 324.052 |
| 0.7097222222222223 | 305.898 |
| 0.7104166666666667 | 319.517 |
| 0.7111111111111111 | 314.98 |
| 0.7118055555555555 | 310.44 |
| 0.7125 | 305.898 |
| 0.7131944444444445 | 305.898 |
| 0.7138888888888889 | 278.603 |
| 0.7145833333333332 | 292.259 |
| 0.7152777777777778 | 260.373 |
| 0.7159722222222222 | 269.49 |
| 0.7166666666666667 | 269.49 |
| 0.717361111111111 | 269.49 |
| 0.7180555555555556 | 242.127 |
| 0.71875 | 264.932 |
| 0.7194444444444444 | 310.44 |
| 0.720138888888889 | 328.584 |
| 0.7208333333333333 | 351.198 |
| 0.7215277777777778 | 360.221 |
| 0.7222222222222222 | 360.221 |
| 0.7229166666666668 | 360.221 |
| 0.7236111111111111 | 360.221 |
| 0.7243055555555555 | 355.712 |
| 0.725 | 342.162 |
| 0.7256944444444445 | 333.113 |
| 0.7263888888888889 | 324.052 |
| 0.7270833333333333 | 314.98 |
| 0.7277777777777777 | 305.898 |
| 0.7284722222222223 | 301.354 |
| 0.7291666666666666 | 292.259 |
| 0.7298611111111111 | 278.603 |
| 0.7305555555555556 | 223.873 |
| 0.7312500000000001 | 223.873 |
| 0.7319444444444444 | 233 |
| 0.7326388888888888 | 223.873 |
| 0.7333333333333334 | 228.436 |
| 0.7340277777777778 | 228.436 |
| 0.7347222222222222 | 219.309 |
| 0.7354166666666666 | 210.182 |
| 0.7361111111111112 | 219.309 |
| 0.7368055555555556 | 219.309 |
| 0.7374999999999999 | 214.746 |
| 0.7381944444444444 | 210.182 |
| 0.7388888888888889 | 210.182 |
| 0.7395833333333334 | 191.937 |
| 0.7402777777777777 | 205.62 |
| 0.7409722222222223 | 210.182 |
| 0.7416666666666667 | 214.746 |
| 0.7423611111111111 | 219.309 |
| 0.7430555555555555 | 219.309 |
| 0.74375 | 214.746 |
| 0.7444444444444445 | 214.746 |
| 0.7451388888888889 | 210.182 |
| 0.7458333333333332 | 210.182 |
| 0.7465277777777778 | 210.182 |
| 0.7472222222222222 | 210.182 |
| 0.7479166666666667 | 205.62 |
| 0.748611111111111 | 210.182 |
| 0.7493055555555556 | 210.182 |
| 0.75 | 201.058 |
| 0.7506944444444444 | 201.058 |
| 0.751388888888889 | 191.937 |
| 0.7520833333333333 | 187.378 |
| 0.7527777777777778 | 178.264 |
| 0.7534722222222222 | 164.605 |
| 0.7541666666666668 | 164.605 |
| 0.7548611111111111 | 160.056 |
| 0.7555555555555555 | 155.509 |
| 0.75625 | 150.964 |
| 0.7569444444444445 | 146.423 |
| 0.7576388888888889 | 146.423 |
| 0.7583333333333333 | 137.347 |
| 0.7590277777777777 | 132.814 |
| 0.7597222222222223 | 128.284 |
| 0.7604166666666666 | 123.758 |
| 0.7611111111111111 | 123.758 |
| 0.7618055555555556 | 119.235 |
| 0.7625000000000001 | 114.716 |
| 0.7631944444444444 | 110.201 |
| 0.7638888888888888 | 110.201 |
| 0.7645833333333334 | 119.235 |
| 0.7652777777777778 | 114.716 |
| 0.7659722222222222 | 101.184 |
| 0.7666666666666666 | 101.184 |
| 0.7673611111111112 | 105.69 |
| 0.7680555555555556 | 114.716 |
| 0.7687499999999999 | 110.201 |
| 0.7694444444444444 | 110.201 |
| 0.7701388888888889 | 105.69 |
| 0.7708333333333334 | 105.69 |
| 0.7715277777777777 | 105.69 |
| 0.7722222222222223 | 101.184 |
| 0.7729166666666667 | 101.184 |
| 0.7736111111111111 | 110.201 |
| 0.7743055555555555 | 87.692 |
| 0.775 | 83.205 |
| 0.7756944444444445 | 83.205 |
| 0.7763888888888889 | 83.205 |
| 0.7770833333333332 | 78.722 |
| 0.7777777777777778 | 78.722 |
| 0.7784722222222222 | 78.722 |
| 0.7791666666666667 | 74.246 |
| 0.779861111111111 | 74.246 |
| 0.7805555555555556 | 74.246 |
| 0.78125 | 74.246 |
| 0.7819444444444444 | 92.184 |
| 0.782638888888889 | 92.184 |
| 0.7833333333333333 | 96.682 |
| 0.7840277777777778 | 96.682 |
| 0.7847222222222222 | 101.184 |
| 0.7854166666666668 | 101.184 |
| 0.7861111111111111 | 101.184 |
| 0.7868055555555555 | 92.184 |
| 0.7875 | 92.184 |
| 0.7881944444444445 | 96.682 |
| 0.7888888888888889 | 101.184 |
| 0.7895833333333333 | 101.184 |
| 0.7902777777777777 | 101.184 |
| 0.7909722222222223 | 105.69 |
| 0.7916666666666666 | 101.184 |
| 0.7923611111111111 | 101.184 |
| 0.7930555555555556 | 96.682 |
| 0.7937500000000001 | 87.692 |
| 0.7944444444444444 | 74.246 |
| 0.7951388888888888 | 65.31 |
| 0.7958333333333334 | 56.398 |
| 0.7965277777777778 | 47.511 |
| 0.7972222222222222 | 38.653 |
| 0.7979166666666666 | 34.234 |
| 0.7986111111111112 | 29.823 |
| 0.7993055555555556 | 29.823 |
| 0.7999999999999999 | 29.823 |
| 0.8006944444444444 | 38.653 |
| 0.8013888888888889 | 47.511 |
| 0.8020833333333334 | 65.31 |
| 0.8027777777777777 | 92.184 |
| 0.8034722222222223 | 128.284 |
| 0.8041666666666667 | 160.056 |
| 0.8048611111111111 | 187.378 |
| 0.8055555555555555 | 205.62 |
| 0.80625 | 210.182 |
| 0.8069444444444445 | 210.182 |
| 0.8076388888888889 | 210.182 |
| 0.8083333333333332 | 210.182 |
| 0.8090277777777778 | 210.182 |
| 0.8097222222222222 | 205.62 |
| 0.8104166666666667 | 201.058 |
| 0.811111111111111 | 187.378 |
| 0.8118055555555556 | 173.709 |
| 0.8125 | 164.605 |
| 0.8131944444444444 | 160.056 |
| 0.813888888888889 | 150.964 |
| 0.8145833333333333 | 146.423 |
| 0.8152777777777778 | 141.884 |
| 0.8159722222222222 | 137.347 |
| 0.8166666666666668 | 137.347 |
| 0.8173611111111111 | 128.284 |
| 0.8180555555555555 | 119.235 |
| 0.81875 | 110.201 |
| 0.8194444444444445 | 105.69 |
| 0.8201388888888889 | 101.184 |
| 0.8208333333333333 | 101.184 |
| 0.8215277777777777 | 101.184 |
| 0.8222222222222223 | 96.682 |
| 0.8229166666666666 | 92.184 |
| 0.8236111111111111 | 92.184 |
| 0.8243055555555556 | 92.184 |
| 0.8250000000000001 | 87.692 |
| 0.8256944444444444 | 87.692 |
| 0.8263888888888888 | 83.205 |
| 0.8270833333333334 | 78.722 |
| 0.8277777777777778 | 74.246 |
| 0.8284722222222222 | 74.246 |
| 0.8291666666666666 | 69.775 |
| 0.8298611111111112 | 65.31 |
| 0.8305555555555556 | 60.85 |
| 0.8312499999999999 | 56.398 |
| 0.8319444444444444 | 51.951 |
| 0.8326388888888889 | 47.511 |
| 0.8333333333333334 | 43.079 |
| 0.8340277777777777 | 38.653 |
| 0.8347222222222223 | 38.653 |
| 0.8354166666666667 | 34.234 |
| 0.8361111111111111 | 34.234 |
| 0.8368055555555555 | 34.234 |
| 0.8375 | 34.234 |
| 0.8381944444444445 | 34.234 |
| 0.8388888888888889 | 29.823 |
| 0.8395833333333332 | 29.823 |
| 0.8402777777777778 | 29.823 |
| 0.8409722222222222 | 25.419 |
| 0.8416666666666667 | 25.419 |
| 0.842361111111111 | 21.024 |
| 0.8430555555555556 | 21.024 |
| 0.84375 | 16.636 |
| 0.8444444444444444 | 16.636 |
| 0.845138888888889 | 12.257 |
| 0.8458333333333333 | 12.257 |
| 0.8465277777777778 | 12.257 |
| 0.8472222222222222 | 12.257 |
| 0.8479166666666668 | 7.887 |
| 0.8486111111111111 | 7.887 |
| 0.8493055555555555 | 7.887 |
| 0.85 | 7.887 |
| 0.8506944444444445 | 3.525 |
| 0.8513888888888889 | 3.525 |
| 0.8520833333333333 | 3.525 |
| 0.8527777777777777 | 3.525 |
| 0.8534722222222223 | 3.525 |
| 0.8541666666666666 | 3.525 |
| 0.8548611111111111 | 3.525 |
| 0.8555555555555556 | 3.525 |
| 0.8562500000000001 | 0 |
| 0.8569444444444444 | 0 |
| 0.8576388888888888 | 0 |
| 0.8583333333333334 | 0 |
| 0.8590277777777778 | 0 |
| 0.8597222222222222 | 0 |
| 0.8604166666666666 | 0 |
| 0.8611111111111112 | 0 |
| 0.8618055555555556 | 0 |
| 0.8624999999999999 | 0 |
| 0.8631944444444444 | 0 |
| 0.8638888888888889 | 0 |
| 0.8645833333333334 | 0 |
| 0.8652777777777777 | 0 |
| 0.8659722222222223 | 0 |
| 0.8666666666666667 | 0 |
| 0.8673611111111111 | 0 |
| 0.8680555555555555 | 0 |
| 0.86875 | 0 |
| 0.8694444444444445 | 0 |
| 0.8701388888888889 | 0 |
| 0.8708333333333332 | 0 |
| 0.8715277777777778 | 0 |
| 0.8722222222222222 | 0 |
| 0.8729166666666667 | 0 |
| 0.873611111111111 | 0 |
| 0.8743055555555556 | 0 |
| 0.875 | 0 |
| 0.8756944444444444 | 0 |
| 0.876388888888889 | 0 |
| 0.8770833333333333 | 0 |
| 0.8777777777777778 | 0 |
| 0.8784722222222222 | 0 |
| 0.8791666666666668 | 0 |
| 0.8798611111111111 | 0 |
| 0.8805555555555555 | 0 |
| 0.88125 | 0 |
| 0.8819444444444445 | 0 |
| 0.8826388888888889 | 0 |
| 0.8833333333333333 | 0 |
| 0.8840277777777777 | 0 |
| 0.8847222222222223 | 0 |
| 0.8854166666666666 | 0 |
| 0.8861111111111111 | 0 |
| 0.8868055555555556 | 0 |
| 0.8875000000000001 | 0 |
| 0.8881944444444444 | 0 |
| 0.8888888888888888 | 0 |
| 0.8895833333333334 | 0 |
| 0.8902777777777778 | 0 |
| 0.8909722222222222 | 0 |
| 0.8916666666666666 | 0 |
| 0.8923611111111112 | 0 |
| 0.8930555555555556 | 0 |
| 0.8937499999999999 | 0 |
| 0.8944444444444444 | 0 |
| 0.8951388888888889 | 0 |
| 0.8958333333333334 | 0 |
| 0.8965277777777777 | 0 |
| 0.8972222222222223 | 0 |
| 0.8979166666666667 | 0 |
| 0.8986111111111111 | 0 |
| 0.8993055555555555 | 0 |
| 0.9 | 0 |
| 0.9006944444444445 | 0 |
| 0.9013888888888889 | 0 |
| 0.9020833333333332 | 0 |
| 0.9027777777777778 | 0 |
| 0.9034722222222222 | 0 |
| 0.9041666666666667 | 0 |
| 0.904861111111111 | 0 |
| 0.9055555555555556 | 0 |
| 0.90625 | 0 |
| 0.9069444444444444 | 0 |
| 0.907638888888889 | 0 |
| 0.9083333333333333 | 0 |
| 0.9090277777777778 | 0 |
| 0.9097222222222222 | 0 |
| 0.9104166666666668 | 0 |
| 0.9111111111111111 | 0 |
| 0.9118055555555555 | 0 |
| 0.9125 | 0 |
| 0.9131944444444445 | 0 |
| 0.9138888888888889 | 0 |
| 0.9145833333333333 | 0 |
| 0.9152777777777777 | 0 |
| 0.9159722222222223 | 0 |
| 0.9166666666666666 | 0 |
| 0.9173611111111111 | 0 |
| 0.9180555555555556 | 0 |
| 0.9187500000000001 | 0 |
| 0.9194444444444444 | 0 |
| 0.9201388888888888 | 0 |
| 0.9208333333333334 | 0 |
| 0.9215277777777778 | 0 |
| 0.9222222222222222 | 0 |
| 0.9229166666666666 | 0 |
| 0.9236111111111112 | 0 |
| 0.9243055555555556 | 0 |
| 0.9249999999999999 | 0 |
| 0.9256944444444444 | 0 |
| 0.9263888888888889 | 0 |
| 0.9270833333333334 | 0 |
| 0.9277777777777777 | 0 |
| 0.9284722222222223 | 0 |
| 0.9291666666666667 | 0 |
| 0.9298611111111111 | 0 |
| 0.9305555555555555 | 0 |
| 0.93125 | 0 |
| 0.9319444444444445 | 0 |
| 0.9326388888888889 | 0 |
| 0.9333333333333332 | 0 |
| 0.9340277777777778 | 0 |
| 0.9347222222222222 | 0 |
| 0.9354166666666667 | 0 |
| 0.936111111111111 | 0 |
| 0.9368055555555556 | 0 |
| 0.9375 | 0 |
| 0.9381944444444444 | 0 |
| 0.938888888888889 | 0 |
| 0.9395833333333333 | 0 |
| 0.9402777777777778 | 0 |
| 0.9409722222222222 | 0 |
| 0.9416666666666668 | 0 |
| 0.9423611111111111 | 0 |
| 0.9430555555555555 | 0 |
| 0.94375 | 0 |
| 0.9444444444444445 | 0 |
| 0.9451388888888889 | 0 |
| 0.9458333333333333 | 0 |
| 0.9465277777777777 | 0 |
| 0.9472222222222223 | 0 |
| 0.9479166666666666 | 0 |
| 0.9486111111111111 | 0 |
| 0.9493055555555556 | 0 |
| 0.9500000000000001 | 0 |
| 0.9506944444444444 | 0 |
| 0.9513888888888888 | 0 |
| 0.9520833333333334 | 0 |
| 0.9527777777777778 | 0 |
| 0.9534722222222222 | 0 |
| 0.9541666666666666 | 0 |
| 0.9548611111111112 | 0 |
| 0.9555555555555556 | 0 |
| 0.9562499999999999 | 0 |
| 0.9569444444444444 | 0 |
| 0.9576388888888889 | 0 |
| 0.9583333333333334 | 0 |
| 0.9590277777777777 | 0 |
| 0.9597222222222223 | 0 |
| 0.9604166666666667 | 0 |
| 0.9611111111111111 | 0 |
| 0.9618055555555555 | 0 |
| 0.9625 | 0 |
| 0.9631944444444445 | 0 |
| 0.9638888888888889 | 0 |
| 0.9645833333333332 | 0 |
| 0.9652777777777778 | 0 |
| 0.9659722222222222 | 0 |
| 0.9666666666666667 | 0 |
| 0.967361111111111 | 0 |
| 0.9680555555555556 | 0 |
| 0.96875 | 0 |
| 0.9694444444444444 | 0 |
| 0.970138888888889 | 0 |
| 0.9708333333333333 | 0 |
| 0.9715277777777778 | 0 |
| 0.9722222222222222 | 0 |
| 0.9729166666666668 | 0 |
| 0.9736111111111111 | 0 |
| 0.9743055555555555 | 0 |
| 0.975 | 0 |
| 0.9756944444444445 | 0 |
| 0.9763888888888889 | 0 |
| 0.9770833333333333 | 0 |
| 0.9777777777777777 | 0 |
| 0.9784722222222223 | 0 |
| 0.9791666666666666 | 0 |
| 0.9798611111111111 | 0 |
| 0.9805555555555556 | 0 |
| 0.9812500000000001 | 0 |
| 0.9819444444444444 | 0 |
| 0.9826388888888888 | 0 |
| 0.9833333333333334 | 0 |
| 0.9840277777777778 | 0 |
| 0.9847222222222222 | 0 |
| 0.9854166666666666 | 0 |
| 0.9861111111111112 | 0 |
| 0.9868055555555556 | 0 |
| 0.9874999999999999 | 0 |
| 0.9881944444444444 | 0 |
| 0.9888888888888889 | 0 |
| 0.9895833333333334 | 0 |
| 0.9902777777777777 | 0 |
| 0.9909722222222223 | 0 |
| 0.9916666666666667 | 0 |
| 0.9923611111111111 | 0 |
| 0.9930555555555555 | 0 |
| 0.99375 | 0 |
| 0.9944444444444445 | 0 |
| 0.9951388888888889 | 0 |
| 0.9958333333333332 | 0 |
| 0.9965277777777778 | 0 |
| 0.9972222222222222 | 0 |
| 0.9979166666666667 | 0 |
| 0.998611111111111 | 0 |
| 0.9993055555555556 | 0 |